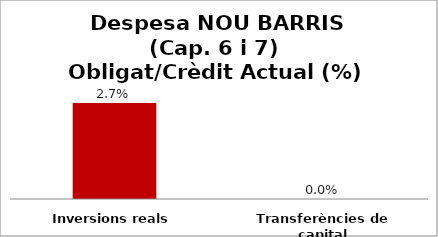
| Category | Series 0 |
|---|---|
| Inversions reals | 0.027 |
| Transferències de capital | 0 |